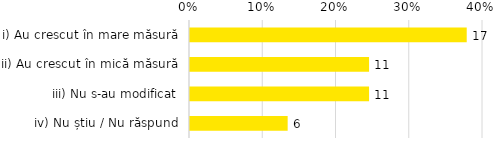
| Category | Total |
|---|---|
| i) Au crescut în mare măsură | 0.378 |
| ii) Au crescut în mică măsură | 0.244 |
| iii) Nu s-au modificat | 0.244 |
| iv) Nu știu / Nu răspund | 0.133 |